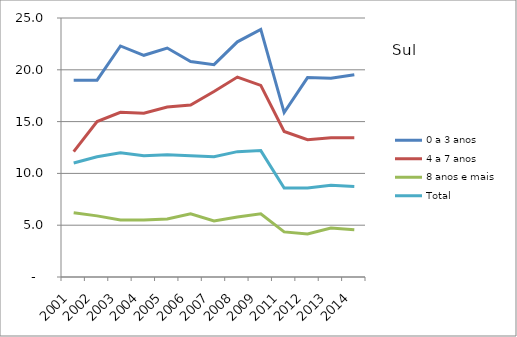
| Category | 0 a 3 anos | 4 a 7 anos | 8 anos e mais | Total |
|---|---|---|---|---|
| 2001.0 | 19 | 12.1 | 6.2 | 11 |
| 2002.0 | 19 | 15 | 5.9 | 11.6 |
| 2003.0 | 22.3 | 15.9 | 5.5 | 12 |
| 2004.0 | 21.4 | 15.8 | 5.5 | 11.7 |
| 2005.0 | 22.1 | 16.4 | 5.6 | 11.8 |
| 2006.0 | 20.8 | 16.6 | 6.1 | 11.7 |
| 2007.0 | 20.5 | 17.9 | 5.4 | 11.6 |
| 2008.0 | 22.7 | 19.3 | 5.8 | 12.1 |
| 2009.0 | 23.9 | 18.5 | 6.1 | 12.2 |
| 2011.0 | 15.872 | 14.046 | 4.353 | 8.59 |
| 2012.0 | 19.246 | 13.25 | 4.145 | 8.601 |
| 2013.0 | 19.186 | 13.446 | 4.732 | 8.859 |
| 2014.0 | 19.53 | 13.435 | 4.571 | 8.741 |